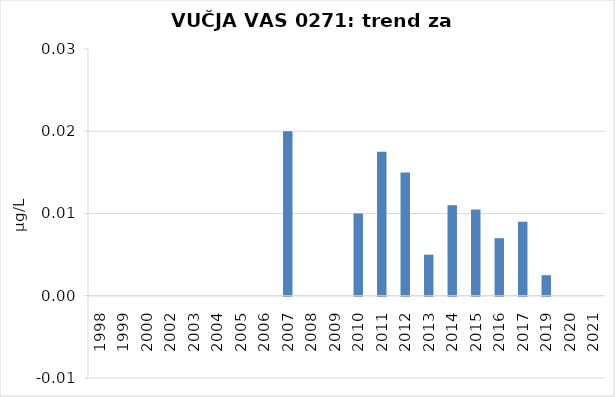
| Category | Vsota |
|---|---|
| 1998 | 0 |
| 1999 | 0 |
| 2000 | 0 |
| 2002 | 0 |
| 2003 | 0 |
| 2004 | 0 |
| 2005 | 0 |
| 2006 | 0 |
| 2007 | 0.02 |
| 2008 | 0 |
| 2009 | 0 |
| 2010 | 0.01 |
| 2011 | 0.017 |
| 2012 | 0.015 |
| 2013 | 0.005 |
| 2014 | 0.011 |
| 2015 | 0.01 |
| 2016 | 0.007 |
| 2017 | 0.009 |
| 2019 | 0.002 |
| 2020 | 0 |
| 2021 | 0 |